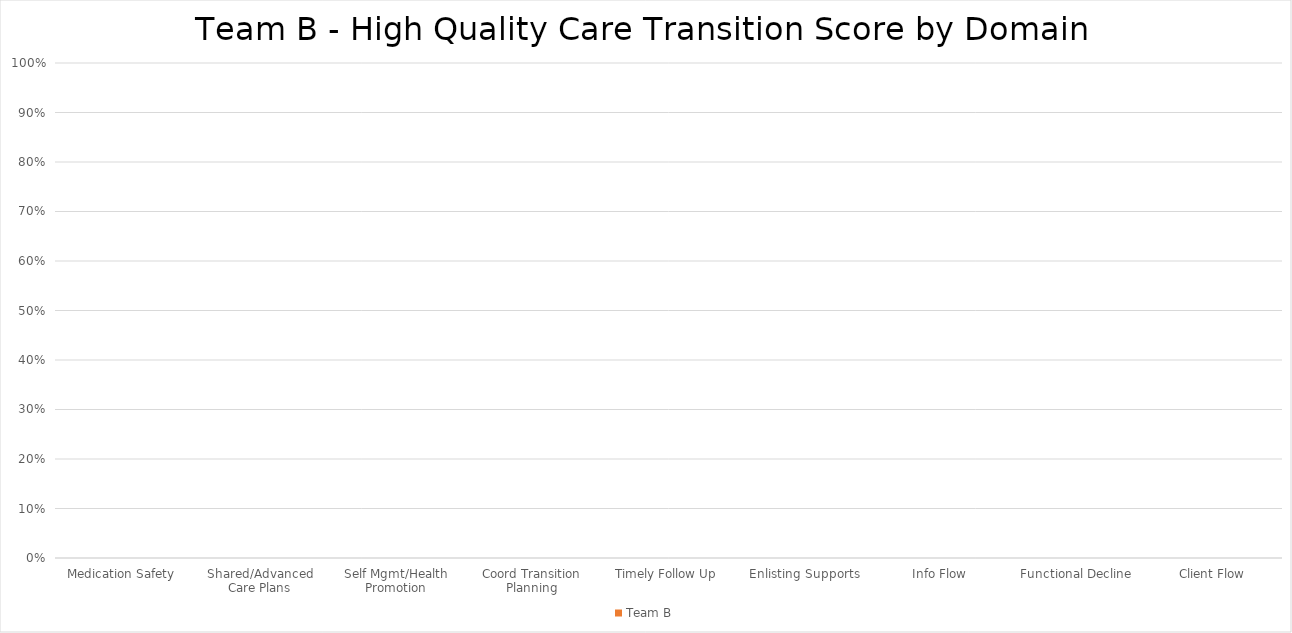
| Category | Team B |
|---|---|
| Medication Safety | 0 |
| Shared/Advanced Care Plans | 0 |
| Self Mgmt/Health Promotion | 0 |
| Coord Transition Planning | 0 |
| Timely Follow Up | 0 |
| Enlisting Supports | 0 |
| Info Flow | 0 |
| Functional Decline | 0 |
| Client Flow | 0 |